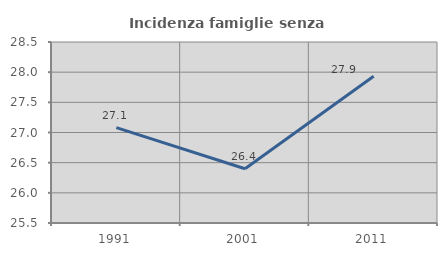
| Category | Incidenza famiglie senza nuclei |
|---|---|
| 1991.0 | 27.08 |
| 2001.0 | 26.4 |
| 2011.0 | 27.933 |